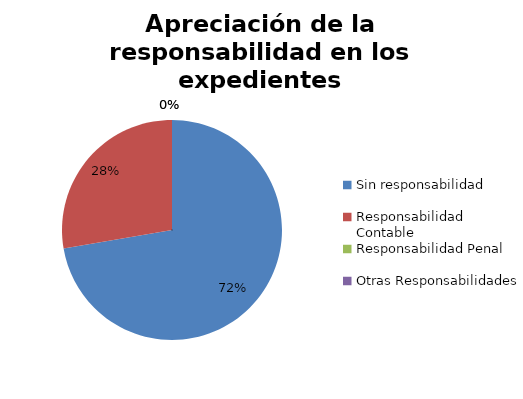
| Category | Series 0 |
|---|---|
| Sin responsabilidad | 154 |
| Responsabilidad Contable | 59 |
| Responsabilidad Penal | 0 |
| Otras Responsabilidades | 0 |